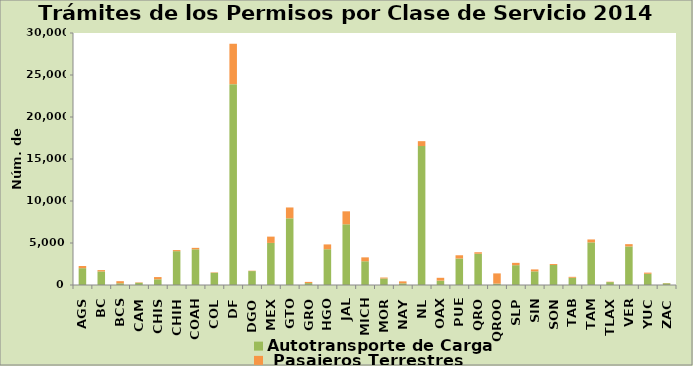
| Category | Autotransporte de Carga  |  Pasajeros Terrestres |
|---|---|---|
| AGS | 2003 | 257 |
| BC | 1616 | 157 |
| BCS | 206 | 249 |
| CAM | 264 | 50 |
| CHIS | 679 | 265 |
| CHIH | 4028 | 128 |
| COAH | 4250 | 172 |
| COL | 1454 | 51 |
| DF | 23912 | 4807 |
| DGO | 1658 | 43 |
| MEX | 5009 | 751 |
| GTO | 7939 | 1291 |
| GRO | 227 | 143 |
| HGO | 4260 | 572 |
| JAL | 7228 | 1543 |
| MICH | 2828 | 462 |
| MOR | 778 | 109 |
| NAY | 199 | 234 |
| NL | 16541 | 582 |
| OAX | 523 | 335 |
| PUE | 3156 | 384 |
| QRO | 3721 | 179 |
| QROO | 162 | 1219 |
| SLP | 2359 | 278 |
| SIN | 1625 | 231 |
| SON | 2378 | 118 |
| TAB | 861 | 111 |
| TAM | 5077 | 345 |
| TLAX | 349 | 41 |
| VER | 4592 | 271 |
| YUC | 1335 | 137 |
| ZAC | 209 | 21 |